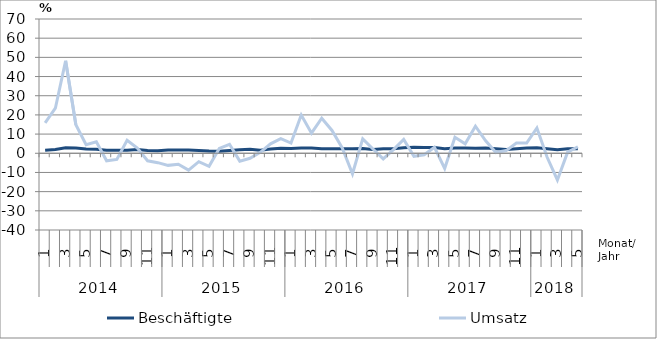
| Category | Beschäftigte | Umsatz |
|---|---|---|
| 0 | 1.6 | 15.9 |
| 1 | 2 | 23.5 |
| 2 | 2.9 | 48.2 |
| 3 | 2.8 | 14.9 |
| 4 | 2.2 | 4.5 |
| 5 | 2.1 | 6 |
| 6 | 1.6 | -3.9 |
| 7 | 1.6 | -3.2 |
| 8 | 1.6 | 6.8 |
| 9 | 2 | 2.7 |
| 10 | 1.4 | -3.9 |
| 11 | 1.3 | -4.9 |
| 12 | 1.7 | -6.3 |
| 13 | 1.7 | -5.7 |
| 14 | 1.7 | -8.8 |
| 15 | 1.5 | -4.4 |
| 16 | 1.2 | -6.8 |
| 17 | 1.1 | 2.5 |
| 18 | 1.5 | 4.7 |
| 19 | 1.8 | -4.1 |
| 20 | 2.1 | -2.6 |
| 21 | 1.6 | 0.5 |
| 22 | 2.2 | 4.9 |
| 23 | 2.6 | 7.6 |
| 24 | 2.5 | 5.3 |
| 25 | 2.7 | 19.9 |
| 26 | 2.8 | 10.5 |
| 27 | 2.4 | 18.3 |
| 28 | 2.4 | 11.9 |
| 29 | 2.4 | 2.8 |
| 30 | 2.3 | -10.7 |
| 31 | 2.5 | 7.5 |
| 32 | 2 | 2.2 |
| 33 | 2.4 | -2.9 |
| 34 | 2.3 | 1.9 |
| 35 | 2.9 | 7.2 |
| 36 | 3.1 | -1.6 |
| 37 | 3 | -0.8 |
| 38 | 3 | 3.1 |
| 39 | 2.4 | -7.9 |
| 40 | 2.8 | 8.3 |
| 41 | 2.7 | 4.9 |
| 42 | 2.6 | 14.1 |
| 43 | 2.7 | 6.5 |
| 44 | 2.3 | 0.4 |
| 45 | 2 | 1.4 |
| 46 | 2.4 | 5.3 |
| 47 | 2.8 | 5.3 |
| 48 | 2.9 | 13.2 |
| 49 | 2.4 | -2.1 |
| 50 | 1.8 | -13.9 |
| 51 | 2.4 | 0.6 |
| 52 | 2.3 | 3.4 |